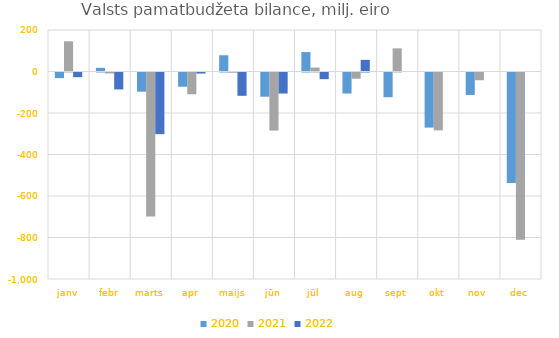
| Category | 2020 | 2021 | 2022 |
|---|---|---|---|
| janv | -27008.783 | 145495.451 | -22576.613 |
| febr | 17739.259 | -4522.432 | -81631.044 |
| marts | -92437.362 | -694525.982 | -297136.226 |
| apr | -68618.758 | -104877.798 | -5088.903 |
| maijs | 78305.058 | -1156.411 | -112366.131 |
| jūn | -116676.414 | -279832.241 | -101334.812 |
| jūl | 93597.468 | 19028.311 | -31986.255 |
| aug | -101242.931 | -30047.233 | 56068.97 |
| sept | -118985.258 | 111497.077 | 0 |
| okt | -265582.087 | -278801.691 | 0 |
| nov | -108180.558 | -37283.727 | 0 |
| dec | -532871.659 | -805850.118 | 0 |